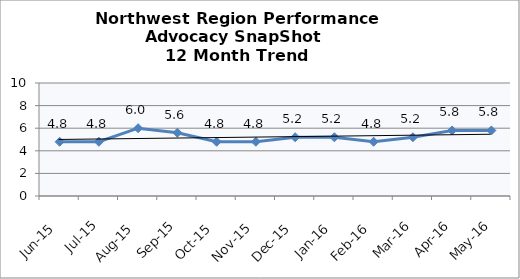
| Category | Northwest Region |
|---|---|
| Jun-15 | 4.8 |
| Jul-15 | 4.8 |
| Aug-15 | 6 |
| Sep-15 | 5.6 |
| Oct-15 | 4.8 |
| Nov-15 | 4.8 |
| Dec-15 | 5.2 |
| Jan-16 | 5.2 |
| Feb-16 | 4.8 |
| Mar-16 | 5.2 |
| Apr-16 | 5.8 |
| May-16 | 5.8 |